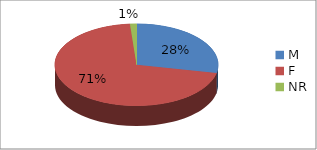
| Category | Series 0 |
|---|---|
| M | 22 |
| F | 55 |
| NR | 1 |